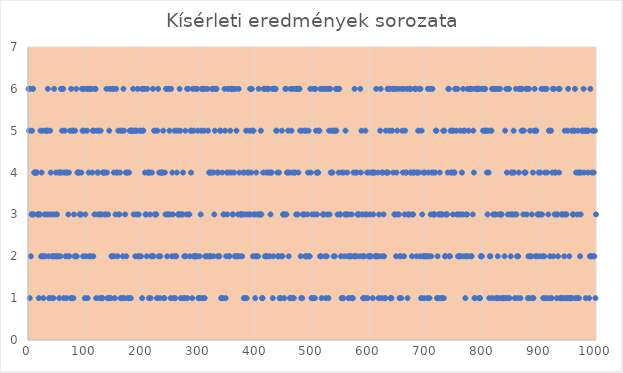
| Category | Series 0 |
|---|---|
| 1.0 | 6 |
| 2.0 | 5 |
| 3.0 | 1 |
| 4.0 | 6 |
| 5.0 | 2 |
| 6.0 | 3 |
| 7.0 | 5 |
| 8.0 | 3 |
| 9.0 | 6 |
| 10.0 | 3 |
| 11.0 | 4 |
| 12.0 | 4 |
| 13.0 | 4 |
| 14.0 | 4 |
| 15.0 | 4 |
| 16.0 | 4 |
| 17.0 | 3 |
| 18.0 | 3 |
| 19.0 | 1 |
| 20.0 | 3 |
| 21.0 | 3 |
| 22.0 | 5 |
| 23.0 | 2 |
| 24.0 | 4 |
| 25.0 | 2 |
| 26.0 | 5 |
| 27.0 | 1 |
| 28.0 | 2 |
| 29.0 | 3 |
| 30.0 | 2 |
| 31.0 | 5 |
| 32.0 | 5 |
| 33.0 | 3 |
| 34.0 | 5 |
| 35.0 | 6 |
| 36.0 | 2 |
| 37.0 | 1 |
| 38.0 | 3 |
| 39.0 | 5 |
| 40.0 | 4 |
| 41.0 | 1 |
| 42.0 | 2 |
| 43.0 | 3 |
| 44.0 | 2 |
| 45.0 | 1 |
| 46.0 | 6 |
| 47.0 | 2 |
| 48.0 | 3 |
| 49.0 | 4 |
| 50.0 | 2 |
| 51.0 | 3 |
| 52.0 | 2 |
| 53.0 | 2 |
| 54.0 | 4 |
| 55.0 | 1 |
| 56.0 | 4 |
| 57.0 | 2 |
| 58.0 | 6 |
| 59.0 | 4 |
| 60.0 | 5 |
| 61.0 | 6 |
| 62.0 | 6 |
| 63.0 | 1 |
| 64.0 | 4 |
| 65.0 | 5 |
| 66.0 | 2 |
| 67.0 | 4 |
| 68.0 | 1 |
| 69.0 | 4 |
| 70.0 | 2 |
| 71.0 | 3 |
| 72.0 | 4 |
| 73.0 | 2 |
| 74.0 | 5 |
| 75.0 | 1 |
| 76.0 | 6 |
| 77.0 | 1 |
| 78.0 | 5 |
| 79.0 | 5 |
| 80.0 | 1 |
| 81.0 | 3 |
| 82.0 | 2 |
| 83.0 | 5 |
| 84.0 | 2 |
| 85.0 | 6 |
| 86.0 | 2 |
| 87.0 | 4 |
| 88.0 | 4 |
| 89.0 | 4 |
| 90.0 | 4 |
| 91.0 | 3 |
| 92.0 | 3 |
| 93.0 | 3 |
| 94.0 | 4 |
| 95.0 | 6 |
| 96.0 | 5 |
| 97.0 | 2 |
| 98.0 | 6 |
| 99.0 | 5 |
| 100.0 | 1 |
| 101.0 | 3 |
| 102.0 | 2 |
| 103.0 | 6 |
| 104.0 | 5 |
| 105.0 | 1 |
| 106.0 | 6 |
| 107.0 | 4 |
| 108.0 | 2 |
| 109.0 | 6 |
| 110.0 | 2 |
| 111.0 | 6 |
| 112.0 | 6 |
| 113.0 | 4 |
| 114.0 | 5 |
| 115.0 | 2 |
| 116.0 | 5 |
| 117.0 | 3 |
| 118.0 | 6 |
| 119.0 | 6 |
| 120.0 | 1 |
| 121.0 | 5 |
| 122.0 | 4 |
| 123.0 | 3 |
| 124.0 | 4 |
| 125.0 | 5 |
| 126.0 | 1 |
| 127.0 | 3 |
| 128.0 | 5 |
| 129.0 | 3 |
| 130.0 | 1 |
| 131.0 | 1 |
| 132.0 | 4 |
| 133.0 | 4 |
| 134.0 | 4 |
| 135.0 | 3 |
| 136.0 | 4 |
| 137.0 | 3 |
| 138.0 | 6 |
| 139.0 | 4 |
| 140.0 | 1 |
| 141.0 | 3 |
| 142.0 | 1 |
| 143.0 | 5 |
| 144.0 | 6 |
| 145.0 | 1 |
| 146.0 | 1 |
| 147.0 | 2 |
| 148.0 | 2 |
| 149.0 | 6 |
| 150.0 | 6 |
| 151.0 | 4 |
| 152.0 | 2 |
| 153.0 | 1 |
| 154.0 | 3 |
| 155.0 | 6 |
| 156.0 | 4 |
| 157.0 | 4 |
| 158.0 | 2 |
| 159.0 | 5 |
| 160.0 | 3 |
| 161.0 | 3 |
| 162.0 | 4 |
| 163.0 | 1 |
| 164.0 | 5 |
| 165.0 | 5 |
| 166.0 | 1 |
| 167.0 | 2 |
| 168.0 | 6 |
| 169.0 | 5 |
| 170.0 | 1 |
| 171.0 | 3 |
| 172.0 | 4 |
| 173.0 | 2 |
| 174.0 | 4 |
| 175.0 | 4 |
| 176.0 | 1 |
| 177.0 | 1 |
| 178.0 | 4 |
| 179.0 | 5 |
| 180.0 | 5 |
| 181.0 | 1 |
| 182.0 | 5 |
| 183.0 | 5 |
| 184.0 | 5 |
| 185.0 | 6 |
| 186.0 | 3 |
| 187.0 | 5 |
| 188.0 | 5 |
| 189.0 | 2 |
| 190.0 | 5 |
| 191.0 | 3 |
| 192.0 | 5 |
| 193.0 | 6 |
| 194.0 | 2 |
| 195.0 | 3 |
| 196.0 | 2 |
| 197.0 | 5 |
| 198.0 | 5 |
| 199.0 | 2 |
| 200.0 | 6 |
| 201.0 | 1 |
| 202.0 | 5 |
| 203.0 | 5 |
| 204.0 | 6 |
| 205.0 | 6 |
| 206.0 | 4 |
| 207.0 | 3 |
| 208.0 | 3 |
| 209.0 | 2 |
| 210.0 | 6 |
| 211.0 | 4 |
| 212.0 | 4 |
| 213.0 | 1 |
| 214.0 | 4 |
| 215.0 | 3 |
| 216.0 | 1 |
| 217.0 | 2 |
| 218.0 | 4 |
| 219.0 | 2 |
| 220.0 | 6 |
| 221.0 | 2 |
| 222.0 | 5 |
| 223.0 | 3 |
| 224.0 | 5 |
| 225.0 | 3 |
| 226.0 | 3 |
| 227.0 | 1 |
| 228.0 | 5 |
| 229.0 | 6 |
| 230.0 | 2 |
| 231.0 | 4 |
| 232.0 | 1 |
| 233.0 | 2 |
| 234.0 | 4 |
| 235.0 | 4 |
| 236.0 | 4 |
| 237.0 | 4 |
| 238.0 | 5 |
| 239.0 | 1 |
| 240.0 | 1 |
| 241.0 | 4 |
| 242.0 | 3 |
| 243.0 | 6 |
| 244.0 | 6 |
| 245.0 | 2 |
| 246.0 | 3 |
| 247.0 | 3 |
| 248.0 | 6 |
| 249.0 | 5 |
| 250.0 | 3 |
| 251.0 | 1 |
| 252.0 | 6 |
| 253.0 | 2 |
| 254.0 | 4 |
| 255.0 | 3 |
| 256.0 | 1 |
| 257.0 | 2 |
| 258.0 | 5 |
| 259.0 | 1 |
| 260.0 | 2 |
| 261.0 | 2 |
| 262.0 | 4 |
| 263.0 | 5 |
| 264.0 | 3 |
| 265.0 | 3 |
| 266.0 | 3 |
| 267.0 | 6 |
| 268.0 | 5 |
| 269.0 | 1 |
| 270.0 | 3 |
| 271.0 | 3 |
| 272.0 | 3 |
| 273.0 | 4 |
| 274.0 | 1 |
| 275.0 | 2 |
| 276.0 | 1 |
| 277.0 | 5 |
| 278.0 | 2 |
| 279.0 | 3 |
| 280.0 | 6 |
| 281.0 | 1 |
| 282.0 | 6 |
| 283.0 | 3 |
| 284.0 | 3 |
| 285.0 | 2 |
| 286.0 | 5 |
| 287.0 | 4 |
| 288.0 | 5 |
| 289.0 | 1 |
| 290.0 | 6 |
| 291.0 | 2 |
| 292.0 | 5 |
| 293.0 | 2 |
| 294.0 | 2 |
| 295.0 | 6 |
| 296.0 | 2 |
| 297.0 | 2 |
| 298.0 | 6 |
| 299.0 | 5 |
| 300.0 | 1 |
| 301.0 | 1 |
| 302.0 | 2 |
| 303.0 | 1 |
| 304.0 | 3 |
| 305.0 | 5 |
| 306.0 | 6 |
| 307.0 | 6 |
| 308.0 | 1 |
| 309.0 | 6 |
| 310.0 | 5 |
| 311.0 | 1 |
| 312.0 | 2 |
| 313.0 | 6 |
| 314.0 | 2 |
| 315.0 | 2 |
| 316.0 | 6 |
| 317.0 | 5 |
| 318.0 | 2 |
| 319.0 | 4 |
| 320.0 | 4 |
| 321.0 | 2 |
| 322.0 | 2 |
| 323.0 | 4 |
| 324.0 | 6 |
| 325.0 | 6 |
| 326.0 | 4 |
| 327.0 | 2 |
| 328.0 | 3 |
| 329.0 | 5 |
| 330.0 | 6 |
| 331.0 | 6 |
| 332.0 | 6 |
| 333.0 | 4 |
| 334.0 | 2 |
| 335.0 | 4 |
| 336.0 | 2 |
| 337.0 | 2 |
| 338.0 | 5 |
| 339.0 | 5 |
| 340.0 | 1 |
| 341.0 | 1 |
| 342.0 | 4 |
| 343.0 | 1 |
| 344.0 | 3 |
| 345.0 | 3 |
| 346.0 | 6 |
| 347.0 | 5 |
| 348.0 | 1 |
| 349.0 | 2 |
| 350.0 | 4 |
| 351.0 | 3 |
| 352.0 | 6 |
| 353.0 | 4 |
| 354.0 | 2 |
| 355.0 | 2 |
| 356.0 | 5 |
| 357.0 | 6 |
| 358.0 | 4 |
| 359.0 | 6 |
| 360.0 | 3 |
| 361.0 | 3 |
| 362.0 | 6 |
| 363.0 | 4 |
| 364.0 | 2 |
| 365.0 | 6 |
| 366.0 | 2 |
| 367.0 | 5 |
| 368.0 | 2 |
| 369.0 | 2 |
| 370.0 | 3 |
| 371.0 | 6 |
| 372.0 | 4 |
| 373.0 | 2 |
| 374.0 | 3 |
| 375.0 | 3 |
| 376.0 | 3 |
| 377.0 | 2 |
| 378.0 | 3 |
| 379.0 | 4 |
| 380.0 | 1 |
| 381.0 | 4 |
| 382.0 | 3 |
| 383.0 | 1 |
| 384.0 | 5 |
| 385.0 | 1 |
| 386.0 | 3 |
| 387.0 | 4 |
| 388.0 | 4 |
| 389.0 | 3 |
| 390.0 | 5 |
| 391.0 | 6 |
| 392.0 | 3 |
| 393.0 | 4 |
| 394.0 | 6 |
| 395.0 | 5 |
| 396.0 | 2 |
| 397.0 | 5 |
| 398.0 | 3 |
| 399.0 | 3 |
| 400.0 | 1 |
| 401.0 | 2 |
| 402.0 | 4 |
| 403.0 | 2 |
| 404.0 | 3 |
| 405.0 | 2 |
| 406.0 | 6 |
| 407.0 | 3 |
| 408.0 | 3 |
| 409.0 | 3 |
| 410.0 | 5 |
| 411.0 | 3 |
| 412.0 | 1 |
| 413.0 | 1 |
| 414.0 | 4 |
| 415.0 | 6 |
| 416.0 | 6 |
| 417.0 | 2 |
| 418.0 | 6 |
| 419.0 | 4 |
| 420.0 | 2 |
| 421.0 | 2 |
| 422.0 | 6 |
| 423.0 | 4 |
| 424.0 | 6 |
| 425.0 | 4 |
| 426.0 | 2 |
| 427.0 | 3 |
| 428.0 | 4 |
| 429.0 | 4 |
| 430.0 | 6 |
| 431.0 | 1 |
| 432.0 | 2 |
| 433.0 | 6 |
| 434.0 | 6 |
| 435.0 | 6 |
| 436.0 | 6 |
| 437.0 | 5 |
| 438.0 | 5 |
| 439.0 | 4 |
| 440.0 | 2 |
| 441.0 | 2 |
| 442.0 | 4 |
| 443.0 | 1 |
| 444.0 | 1 |
| 445.0 | 1 |
| 446.0 | 2 |
| 447.0 | 5 |
| 448.0 | 2 |
| 449.0 | 3 |
| 450.0 | 3 |
| 451.0 | 1 |
| 452.0 | 3 |
| 453.0 | 6 |
| 454.0 | 6 |
| 455.0 | 3 |
| 456.0 | 4 |
| 457.0 | 4 |
| 458.0 | 5 |
| 459.0 | 2 |
| 460.0 | 4 |
| 461.0 | 1 |
| 462.0 | 6 |
| 463.0 | 1 |
| 464.0 | 5 |
| 465.0 | 4 |
| 466.0 | 6 |
| 467.0 | 1 |
| 468.0 | 1 |
| 469.0 | 4 |
| 470.0 | 4 |
| 471.0 | 6 |
| 472.0 | 3 |
| 473.0 | 6 |
| 474.0 | 6 |
| 475.0 | 3 |
| 476.0 | 4 |
| 477.0 | 6 |
| 478.0 | 6 |
| 479.0 | 5 |
| 480.0 | 2 |
| 481.0 | 1 |
| 482.0 | 5 |
| 483.0 | 1 |
| 484.0 | 3 |
| 485.0 | 3 |
| 486.0 | 3 |
| 487.0 | 5 |
| 488.0 | 2 |
| 489.0 | 5 |
| 490.0 | 2 |
| 491.0 | 2 |
| 492.0 | 3 |
| 493.0 | 4 |
| 494.0 | 5 |
| 495.0 | 2 |
| 496.0 | 2 |
| 497.0 | 6 |
| 498.0 | 4 |
| 499.0 | 1 |
| 500.0 | 3 |
| 501.0 | 1 |
| 502.0 | 1 |
| 503.0 | 6 |
| 504.0 | 3 |
| 505.0 | 1 |
| 506.0 | 6 |
| 507.0 | 5 |
| 508.0 | 4 |
| 509.0 | 3 |
| 510.0 | 4 |
| 511.0 | 4 |
| 512.0 | 5 |
| 513.0 | 5 |
| 514.0 | 2 |
| 515.0 | 6 |
| 516.0 | 2 |
| 517.0 | 1 |
| 518.0 | 6 |
| 519.0 | 3 |
| 520.0 | 3 |
| 521.0 | 3 |
| 522.0 | 6 |
| 523.0 | 2 |
| 524.0 | 1 |
| 525.0 | 6 |
| 526.0 | 2 |
| 527.0 | 3 |
| 528.0 | 6 |
| 529.0 | 1 |
| 530.0 | 5 |
| 531.0 | 3 |
| 532.0 | 6 |
| 533.0 | 4 |
| 534.0 | 5 |
| 535.0 | 4 |
| 536.0 | 4 |
| 537.0 | 5 |
| 538.0 | 2 |
| 539.0 | 5 |
| 540.0 | 2 |
| 541.0 | 5 |
| 542.0 | 6 |
| 543.0 | 5 |
| 544.0 | 6 |
| 545.0 | 3 |
| 546.0 | 6 |
| 547.0 | 4 |
| 548.0 | 6 |
| 549.0 | 3 |
| 550.0 | 3 |
| 551.0 | 2 |
| 552.0 | 1 |
| 553.0 | 4 |
| 554.0 | 1 |
| 555.0 | 1 |
| 556.0 | 4 |
| 557.0 | 2 |
| 558.0 | 3 |
| 559.0 | 5 |
| 560.0 | 3 |
| 561.0 | 3 |
| 562.0 | 4 |
| 563.0 | 2 |
| 564.0 | 1 |
| 565.0 | 3 |
| 566.0 | 2 |
| 567.0 | 2 |
| 568.0 | 1 |
| 569.0 | 2 |
| 570.0 | 3 |
| 571.0 | 1 |
| 572.0 | 1 |
| 573.0 | 4 |
| 574.0 | 2 |
| 575.0 | 6 |
| 576.0 | 2 |
| 577.0 | 4 |
| 578.0 | 2 |
| 579.0 | 4 |
| 580.0 | 3 |
| 581.0 | 3 |
| 582.0 | 3 |
| 583.0 | 3 |
| 584.0 | 2 |
| 585.0 | 6 |
| 586.0 | 4 |
| 587.0 | 5 |
| 588.0 | 3 |
| 589.0 | 2 |
| 590.0 | 1 |
| 591.0 | 1 |
| 592.0 | 2 |
| 593.0 | 3 |
| 594.0 | 5 |
| 595.0 | 1 |
| 596.0 | 3 |
| 597.0 | 4 |
| 598.0 | 1 |
| 599.0 | 2 |
| 600.0 | 4 |
| 601.0 | 2 |
| 602.0 | 3 |
| 603.0 | 2 |
| 604.0 | 2 |
| 605.0 | 4 |
| 606.0 | 4 |
| 607.0 | 1 |
| 608.0 | 3 |
| 609.0 | 4 |
| 610.0 | 4 |
| 611.0 | 2 |
| 612.0 | 2 |
| 613.0 | 6 |
| 614.0 | 2 |
| 615.0 | 2 |
| 616.0 | 4 |
| 617.0 | 1 |
| 618.0 | 3 |
| 619.0 | 2 |
| 620.0 | 5 |
| 621.0 | 6 |
| 622.0 | 1 |
| 623.0 | 4 |
| 624.0 | 2 |
| 625.0 | 4 |
| 626.0 | 3 |
| 627.0 | 2 |
| 628.0 | 1 |
| 629.0 | 1 |
| 630.0 | 5 |
| 631.0 | 4 |
| 632.0 | 4 |
| 633.0 | 6 |
| 634.0 | 4 |
| 635.0 | 6 |
| 636.0 | 5 |
| 637.0 | 6 |
| 638.0 | 1 |
| 639.0 | 1 |
| 640.0 | 1 |
| 641.0 | 5 |
| 642.0 | 6 |
| 643.0 | 4 |
| 644.0 | 6 |
| 645.0 | 3 |
| 646.0 | 3 |
| 647.0 | 6 |
| 648.0 | 2 |
| 649.0 | 4 |
| 650.0 | 5 |
| 651.0 | 3 |
| 652.0 | 6 |
| 653.0 | 3 |
| 654.0 | 1 |
| 655.0 | 2 |
| 656.0 | 2 |
| 657.0 | 1 |
| 658.0 | 6 |
| 659.0 | 5 |
| 660.0 | 4 |
| 661.0 | 6 |
| 662.0 | 2 |
| 663.0 | 3 |
| 664.0 | 5 |
| 665.0 | 4 |
| 666.0 | 4 |
| 667.0 | 6 |
| 668.0 | 1 |
| 669.0 | 3 |
| 670.0 | 3 |
| 671.0 | 3 |
| 672.0 | 6 |
| 673.0 | 4 |
| 674.0 | 6 |
| 675.0 | 4 |
| 676.0 | 2 |
| 677.0 | 3 |
| 678.0 | 3 |
| 679.0 | 4 |
| 680.0 | 4 |
| 681.0 | 6 |
| 682.0 | 6 |
| 683.0 | 6 |
| 684.0 | 2 |
| 685.0 | 4 |
| 686.0 | 4 |
| 687.0 | 5 |
| 688.0 | 4 |
| 689.0 | 6 |
| 690.0 | 2 |
| 691.0 | 6 |
| 692.0 | 1 |
| 693.0 | 5 |
| 694.0 | 3 |
| 695.0 | 2 |
| 696.0 | 4 |
| 697.0 | 1 |
| 698.0 | 2 |
| 699.0 | 4 |
| 700.0 | 2 |
| 701.0 | 2 |
| 702.0 | 2 |
| 703.0 | 1 |
| 704.0 | 6 |
| 705.0 | 4 |
| 706.0 | 2 |
| 707.0 | 1 |
| 708.0 | 6 |
| 709.0 | 3 |
| 710.0 | 2 |
| 711.0 | 4 |
| 712.0 | 6 |
| 713.0 | 3 |
| 714.0 | 4 |
| 715.0 | 3 |
| 716.0 | 3 |
| 717.0 | 4 |
| 718.0 | 5 |
| 719.0 | 5 |
| 720.0 | 1 |
| 721.0 | 2 |
| 722.0 | 1 |
| 723.0 | 3 |
| 724.0 | 3 |
| 725.0 | 4 |
| 726.0 | 1 |
| 727.0 | 3 |
| 728.0 | 3 |
| 729.0 | 1 |
| 730.0 | 3 |
| 731.0 | 5 |
| 732.0 | 1 |
| 733.0 | 5 |
| 734.0 | 2 |
| 735.0 | 2 |
| 736.0 | 3 |
| 737.0 | 3 |
| 738.0 | 3 |
| 739.0 | 4 |
| 740.0 | 6 |
| 741.0 | 6 |
| 742.0 | 2 |
| 743.0 | 2 |
| 744.0 | 5 |
| 745.0 | 4 |
| 746.0 | 4 |
| 747.0 | 5 |
| 748.0 | 3 |
| 749.0 | 5 |
| 750.0 | 4 |
| 751.0 | 4 |
| 752.0 | 6 |
| 753.0 | 6 |
| 754.0 | 5 |
| 755.0 | 3 |
| 756.0 | 6 |
| 757.0 | 2 |
| 758.0 | 3 |
| 759.0 | 2 |
| 760.0 | 2 |
| 761.0 | 5 |
| 762.0 | 3 |
| 763.0 | 2 |
| 764.0 | 4 |
| 765.0 | 3 |
| 766.0 | 6 |
| 767.0 | 5 |
| 768.0 | 2 |
| 769.0 | 5 |
| 770.0 | 1 |
| 771.0 | 3 |
| 772.0 | 2 |
| 773.0 | 3 |
| 774.0 | 6 |
| 775.0 | 2 |
| 776.0 | 5 |
| 777.0 | 6 |
| 778.0 | 6 |
| 779.0 | 6 |
| 780.0 | 2 |
| 781.0 | 2 |
| 782.0 | 6 |
| 783.0 | 3 |
| 784.0 | 5 |
| 785.0 | 4 |
| 786.0 | 1 |
| 787.0 | 1 |
| 788.0 | 6 |
| 789.0 | 6 |
| 790.0 | 6 |
| 791.0 | 6 |
| 792.0 | 6 |
| 793.0 | 6 |
| 794.0 | 1 |
| 795.0 | 6 |
| 796.0 | 1 |
| 797.0 | 2 |
| 798.0 | 2 |
| 799.0 | 2 |
| 800.0 | 6 |
| 801.0 | 5 |
| 802.0 | 6 |
| 803.0 | 6 |
| 804.0 | 5 |
| 805.0 | 6 |
| 806.0 | 5 |
| 807.0 | 5 |
| 808.0 | 4 |
| 809.0 | 3 |
| 810.0 | 5 |
| 811.0 | 4 |
| 812.0 | 1 |
| 813.0 | 2 |
| 814.0 | 2 |
| 815.0 | 5 |
| 816.0 | 5 |
| 817.0 | 6 |
| 818.0 | 1 |
| 819.0 | 3 |
| 820.0 | 6 |
| 821.0 | 6 |
| 822.0 | 3 |
| 823.0 | 3 |
| 824.0 | 1 |
| 825.0 | 6 |
| 826.0 | 1 |
| 827.0 | 2 |
| 828.0 | 6 |
| 829.0 | 3 |
| 830.0 | 1 |
| 831.0 | 6 |
| 832.0 | 3 |
| 833.0 | 3 |
| 834.0 | 3 |
| 835.0 | 1 |
| 836.0 | 1 |
| 837.0 | 1 |
| 838.0 | 1 |
| 839.0 | 2 |
| 840.0 | 5 |
| 841.0 | 1 |
| 842.0 | 6 |
| 843.0 | 4 |
| 844.0 | 1 |
| 845.0 | 3 |
| 846.0 | 6 |
| 847.0 | 6 |
| 848.0 | 1 |
| 849.0 | 3 |
| 850.0 | 2 |
| 851.0 | 4 |
| 852.0 | 3 |
| 853.0 | 4 |
| 854.0 | 3 |
| 855.0 | 5 |
| 856.0 | 4 |
| 857.0 | 1 |
| 858.0 | 3 |
| 859.0 | 6 |
| 860.0 | 3 |
| 861.0 | 2 |
| 862.0 | 1 |
| 863.0 | 2 |
| 864.0 | 4 |
| 865.0 | 6 |
| 866.0 | 6 |
| 867.0 | 1 |
| 868.0 | 6 |
| 869.0 | 5 |
| 870.0 | 6 |
| 871.0 | 5 |
| 872.0 | 3 |
| 873.0 | 5 |
| 874.0 | 4 |
| 875.0 | 4 |
| 876.0 | 4 |
| 877.0 | 6 |
| 878.0 | 3 |
| 879.0 | 6 |
| 880.0 | 1 |
| 881.0 | 2 |
| 882.0 | 6 |
| 883.0 | 1 |
| 884.0 | 5 |
| 885.0 | 2 |
| 886.0 | 2 |
| 887.0 | 3 |
| 888.0 | 1 |
| 889.0 | 4 |
| 890.0 | 1 |
| 891.0 | 5 |
| 892.0 | 6 |
| 893.0 | 2 |
| 894.0 | 5 |
| 895.0 | 5 |
| 896.0 | 2 |
| 897.0 | 3 |
| 898.0 | 3 |
| 899.0 | 4 |
| 900.0 | 3 |
| 901.0 | 2 |
| 902.0 | 4 |
| 903.0 | 3 |
| 904.0 | 6 |
| 905.0 | 3 |
| 906.0 | 2 |
| 907.0 | 1 |
| 908.0 | 6 |
| 909.0 | 2 |
| 910.0 | 4 |
| 911.0 | 1 |
| 912.0 | 6 |
| 913.0 | 6 |
| 914.0 | 4 |
| 915.0 | 1 |
| 916.0 | 3 |
| 917.0 | 5 |
| 918.0 | 5 |
| 919.0 | 2 |
| 920.0 | 1 |
| 921.0 | 5 |
| 922.0 | 1 |
| 923.0 | 4 |
| 924.0 | 6 |
| 925.0 | 2 |
| 926.0 | 6 |
| 927.0 | 3 |
| 928.0 | 4 |
| 929.0 | 4 |
| 930.0 | 3 |
| 931.0 | 1 |
| 932.0 | 3 |
| 933.0 | 2 |
| 934.0 | 6 |
| 935.0 | 4 |
| 936.0 | 6 |
| 937.0 | 1 |
| 938.0 | 1 |
| 939.0 | 3 |
| 940.0 | 1 |
| 941.0 | 3 |
| 942.0 | 1 |
| 943.0 | 3 |
| 944.0 | 2 |
| 945.0 | 5 |
| 946.0 | 1 |
| 947.0 | 3 |
| 948.0 | 3 |
| 949.0 | 1 |
| 950.0 | 5 |
| 951.0 | 6 |
| 952.0 | 1 |
| 953.0 | 2 |
| 954.0 | 1 |
| 955.0 | 1 |
| 956.0 | 1 |
| 957.0 | 5 |
| 958.0 | 1 |
| 959.0 | 3 |
| 960.0 | 3 |
| 961.0 | 5 |
| 962.0 | 5 |
| 963.0 | 6 |
| 964.0 | 1 |
| 965.0 | 4 |
| 966.0 | 1 |
| 967.0 | 3 |
| 968.0 | 5 |
| 969.0 | 4 |
| 970.0 | 1 |
| 971.0 | 4 |
| 972.0 | 2 |
| 973.0 | 3 |
| 974.0 | 4 |
| 975.0 | 5 |
| 976.0 | 5 |
| 977.0 | 5 |
| 978.0 | 6 |
| 979.0 | 4 |
| 980.0 | 5 |
| 981.0 | 5 |
| 982.0 | 1 |
| 983.0 | 5 |
| 984.0 | 5 |
| 985.0 | 5 |
| 986.0 | 4 |
| 987.0 | 5 |
| 988.0 | 1 |
| 989.0 | 2 |
| 990.0 | 6 |
| 991.0 | 2 |
| 992.0 | 2 |
| 993.0 | 4 |
| 994.0 | 5 |
| 995.0 | 2 |
| 996.0 | 4 |
| 997.0 | 2 |
| 998.0 | 5 |
| 999.0 | 1 |
| 1000.0 | 3 |